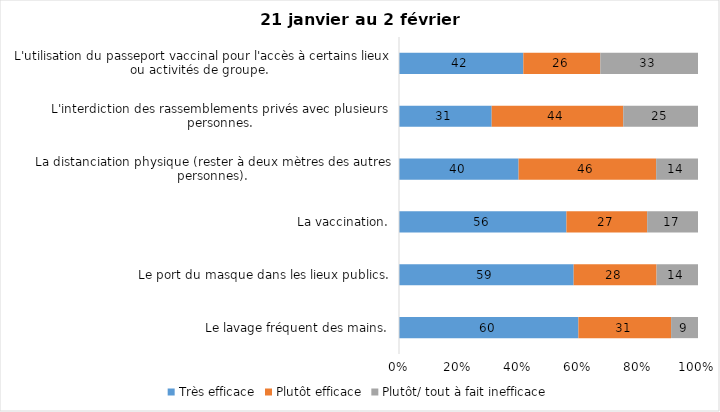
| Category | Très efficace | Plutôt efficace | Plutôt/ tout à fait inefficace |
|---|---|---|---|
| Le lavage fréquent des mains. | 60 | 31 | 9 |
| Le port du masque dans les lieux publics. | 59 | 28 | 14 |
| La vaccination. | 56 | 27 | 17 |
| La distanciation physique (rester à deux mètres des autres personnes). | 40 | 46 | 14 |
| L'interdiction des rassemblements privés avec plusieurs personnes. | 31 | 44 | 25 |
| L'utilisation du passeport vaccinal pour l'accès à certains lieux ou activités de groupe.  | 42 | 26 | 33 |